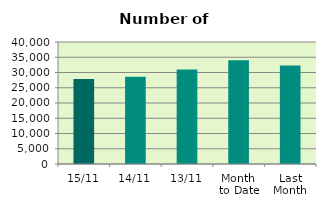
| Category | Series 0 |
|---|---|
| 15/11 | 27840 |
| 14/11 | 28570 |
| 13/11 | 31018 |
| Month 
to Date | 34017.636 |
| Last
Month | 32305.043 |